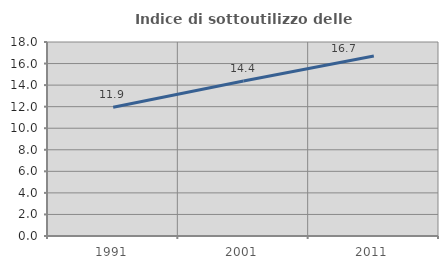
| Category | Indice di sottoutilizzo delle abitazioni  |
|---|---|
| 1991.0 | 11.944 |
| 2001.0 | 14.383 |
| 2011.0 | 16.706 |